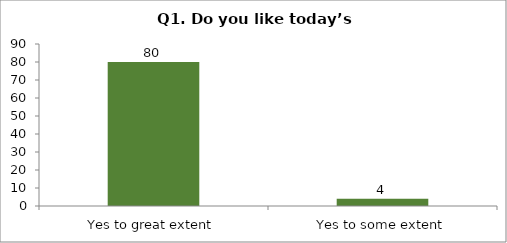
| Category | Q1. Do you like today’s session? |
|---|---|
| Yes to great extent | 80 |
| Yes to some extent | 4 |